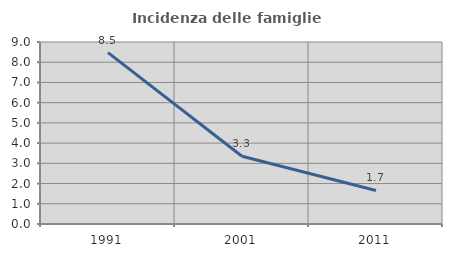
| Category | Incidenza delle famiglie numerose |
|---|---|
| 1991.0 | 8.475 |
| 2001.0 | 3.349 |
| 2011.0 | 1.657 |